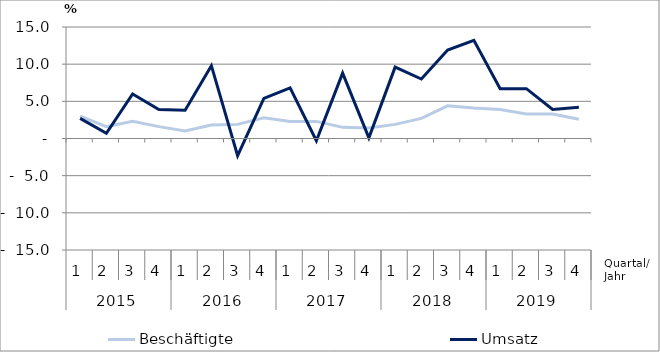
| Category | Beschäftigte | Umsatz |
|---|---|---|
| 0 | 3 | 2.7 |
| 1 | 1.6 | 0.7 |
| 2 | 2.3 | 6 |
| 3 | 1.6 | 3.9 |
| 4 | 1 | 3.8 |
| 5 | 1.8 | 9.8 |
| 6 | 1.9 | -2.3 |
| 7 | 2.8 | 5.4 |
| 8 | 2.3 | 6.8 |
| 9 | 2.3 | -0.3 |
| 10 | 1.5 | 8.8 |
| 11 | 1.4 | 0.1 |
| 12 | 1.9 | 9.6 |
| 13 | 2.7 | 8 |
| 14 | 4.4 | 11.9 |
| 15 | 4.1 | 13.2 |
| 16 | 3.9 | 6.7 |
| 17 | 3.3 | 6.7 |
| 18 | 3.3 | 3.9 |
| 19 | 2.6 | 4.2 |